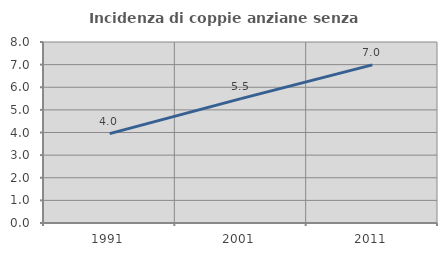
| Category | Incidenza di coppie anziane senza figli  |
|---|---|
| 1991.0 | 3.952 |
| 2001.0 | 5.496 |
| 2011.0 | 6.988 |